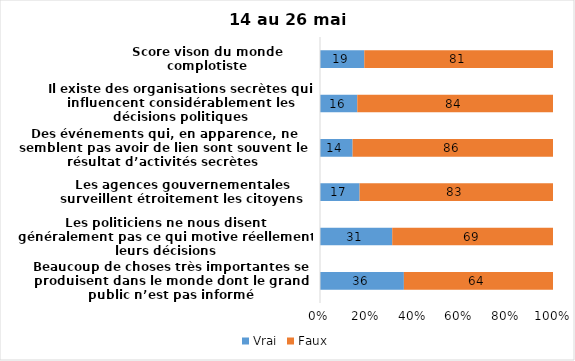
| Category | Vrai | Faux |
|---|---|---|
| Beaucoup de choses très importantes se produisent dans le monde dont le grand public n’est pas informé | 36 | 64 |
| Les politiciens ne nous disent généralement pas ce qui motive réellement leurs décisions | 31 | 69 |
| Les agences gouvernementales surveillent étroitement les citoyens | 17 | 83 |
| Des événements qui, en apparence, ne semblent pas avoir de lien sont souvent le résultat d’activités secrètes | 14 | 86 |
| Il existe des organisations secrètes qui influencent considérablement les décisions politiques | 16 | 84 |
| Score vison du monde complotiste | 19 | 81 |